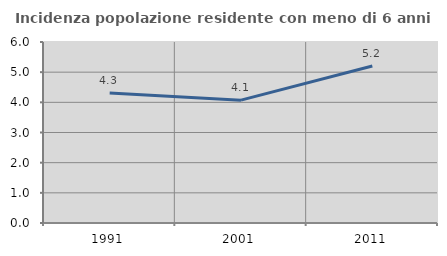
| Category | Incidenza popolazione residente con meno di 6 anni |
|---|---|
| 1991.0 | 4.311 |
| 2001.0 | 4.073 |
| 2011.0 | 5.205 |